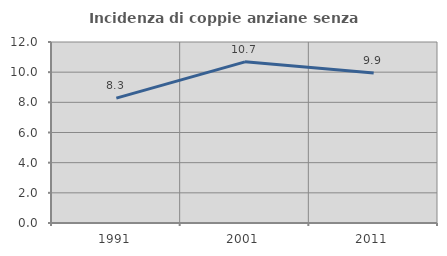
| Category | Incidenza di coppie anziane senza figli  |
|---|---|
| 1991.0 | 8.278 |
| 2001.0 | 10.683 |
| 2011.0 | 9.948 |